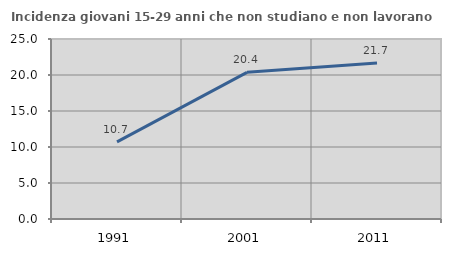
| Category | Incidenza giovani 15-29 anni che non studiano e non lavorano  |
|---|---|
| 1991.0 | 10.714 |
| 2001.0 | 20.37 |
| 2011.0 | 21.667 |